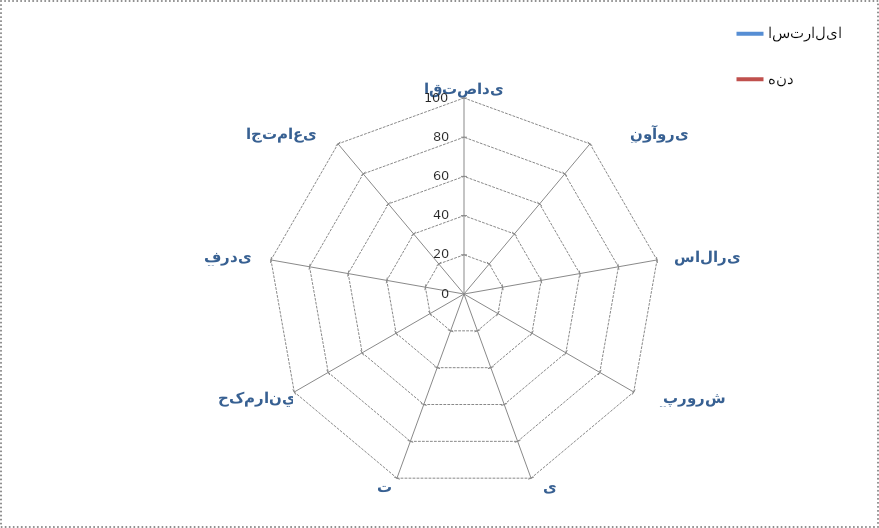
| Category | سوئیس | استرالیا | هند | روسیه |
|---|---|---|---|---|
| ساختار اقتصادی |  | 84 | 58 |  |
| کارآفرینی و نوآوری |  | 81 | 41 |  |
| مردم سالاری |  | 95 | 78 |  |
| آموزش و پرورش |  | 91 | 38 |  |
| تندرستی |  | 90 | 28 |  |
| امنیت |  | 84 | 34 |  |
| حکمراني  |  | 90 | 57 |  |
| آزادی فردی |  | 99 | 67 |  |
| سرمایه اجتماعی |  | 92 | 91 |  |